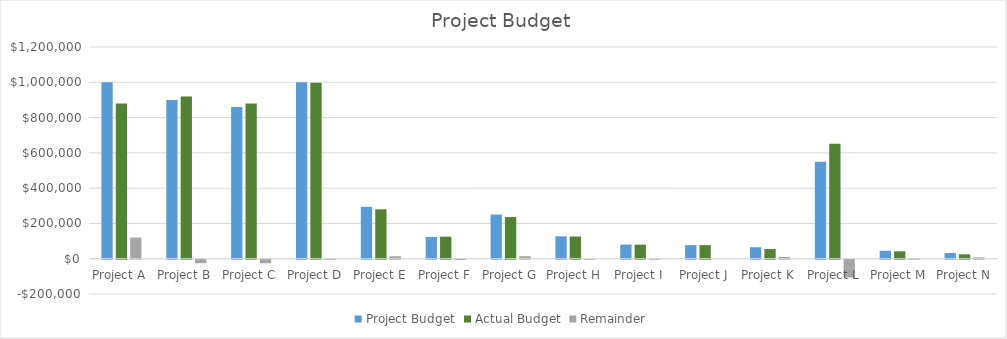
| Category | Project Budget | Actual Budget | Remainder |
|---|---|---|---|
| Project A | 1000000 | 880000 | 120000 |
| Project B | 900000 | 920000 | -20000 |
| Project C | 860000 | 880000 | -20000 |
| Project D | 1000000 | 998050 | 1950 |
| Project E | 294000 | 280000 | 14000 |
| Project F | 123400 | 125000 | -1600 |
| Project G | 250500 | 236000 | 14500 |
| Project H | 127200 | 126000 | 1200 |
| Project I | 80000 | 79900 | 100 |
| Project J | 77000 | 77000 | 0 |
| Project K | 65000 | 55000 | 10000 |
| Project L | 550000 | 651000 | -101000 |
| Project M | 45000 | 42000 | 3000 |
| Project N | 32500 | 25000 | 7500 |